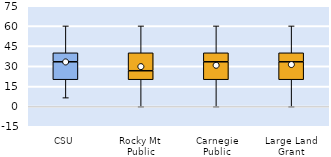
| Category | 25th | 50th | 75th |
|---|---|---|---|
| CSU | 20 | 13.333 | 6.667 |
| Rocky Mt Public | 20 | 6.667 | 13.333 |
| Carnegie Public | 20 | 13.333 | 6.667 |
| Large Land Grant | 20 | 13.333 | 6.667 |